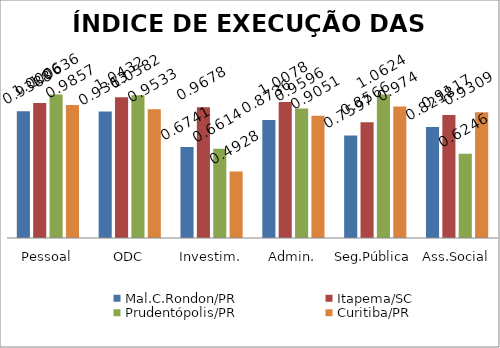
| Category | Mal.C.Rondon/PR | Itapema/SC | Prudentópolis/PR | Toledo/PR | Cascavel/PR | Curitiba/PR |
|---|---|---|---|---|---|---|
| Pessoal | 0.939 | 1.001 | 1.064 |  |  | 0.986 |
| ODC | 0.936 | 1.043 | 1.058 |  |  | 0.953 |
| Investim. | 0.674 | 0.968 | 0.661 |  |  | 0.493 |
| Admin. | 0.874 | 1.008 | 0.96 |  |  | 0.905 |
| Seg.Pública | 0.76 | 0.857 | 1.062 |  |  | 0.974 |
| Ass.Social | 0.822 | 0.912 | 0.625 |  |  | 0.931 |